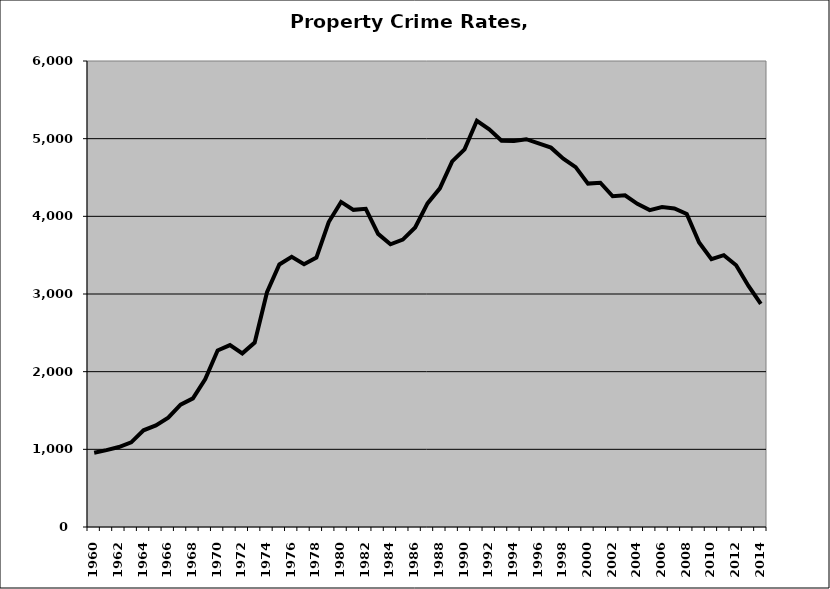
| Category | Property |
|---|---|
| 1960.0 | 955.982 |
| 1961.0 | 989.532 |
| 1962.0 | 1029.465 |
| 1963.0 | 1089.853 |
| 1964.0 | 1244.786 |
| 1965.0 | 1308.852 |
| 1966.0 | 1408.72 |
| 1967.0 | 1574.21 |
| 1968.0 | 1655.91 |
| 1969.0 | 1903.612 |
| 1970.0 | 2272.465 |
| 1971.0 | 2341.527 |
| 1972.0 | 2235.539 |
| 1973.0 | 2374.038 |
| 1974.0 | 3022.32 |
| 1975.0 | 3380.279 |
| 1976.0 | 3477.839 |
| 1977.0 | 3384.036 |
| 1978.0 | 3468.747 |
| 1979.0 | 3926.382 |
| 1980.0 | 4185.473 |
| 1981.0 | 4083.549 |
| 1982.0 | 4096.91 |
| 1983.0 | 3774.087 |
| 1984.0 | 3640.503 |
| 1985.0 | 3700.48 |
| 1986.0 | 3855.963 |
| 1987.0 | 4165.866 |
| 1988.0 | 4360.359 |
| 1989.0 | 4707.396 |
| 1990.0 | 4862.327 |
| 1991.0 | 5230.34 |
| 1992.0 | 5121.248 |
| 1993.0 | 4973.031 |
| 1994.0 | 4970.255 |
| 1995.0 | 4993.134 |
| 1996.0 | 4938.085 |
| 1997.0 | 4884.471 |
| 1998.0 | 4742.804 |
| 1999.0 | 4633.47 |
| 2000.0 | 4421.756 |
| 2001.0 | 4433.004 |
| 2002.0 | 4258.556 |
| 2003.0 | 4270.893 |
| 2004.0 | 4160.521 |
| 2005.0 | 4080.215 |
| 2006.0 | 4119.548 |
| 2007.0 | 4101.818 |
| 2008.0 | 4030.33 |
| 2009.0 | 3663.908 |
| 2010.0 | 3447.324 |
| 2011.0 | 3500.18 |
| 2012.0 | 3370.76 |
| 2013.0 | 3103.194 |
| 2014.0 | 2873.07 |